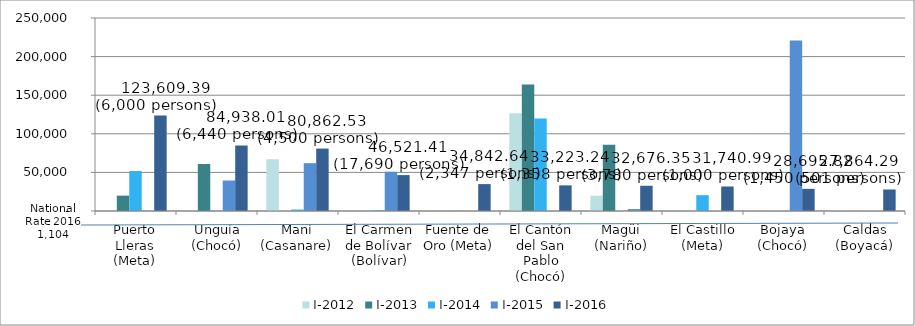
| Category | I-2012 | I-2013 | I-2014 | I-2015 | I-2016 |
|---|---|---|---|---|---|
| Puerto Lleras (Meta) | 0 | 19926.273 | 51777.979 | 224.101 | 123609.394 |
| Unguía (Chocó) | 0 | 60848.146 | 397.957 | 39534.576 | 84938.011 |
| Maní (Casanare) | 66995.516 | 0 | 1885.099 | 61966.771 | 80862.534 |
| El Carmen de Bolívar (Bolívar) | 0 | 0 | 753.732 | 50825.671 | 46521.413 |
| Fuente de Oro (Meta) | 0 | 0 | 245.436 | 0 | 34842.637 |
| El Cantón del San Pablo (Chocó) | 126690.103 | 163921.465 | 119840.555 | 0 | 33223.242 |
| Magüi (Nariño) | 19916.809 | 85838.945 | 0 | 2495.877 | 32676.349 |
| El Castillo (Meta) | 61.275 | 0 | 20514.419 | 0 | 31740.993 |
| Bojaya (Chocó) | 0 | 0 | 0 | 221011.981 | 28695.824 |
| Caldas (Boyacá) | 0 | 0 | 0 | 0 | 27864.294 |